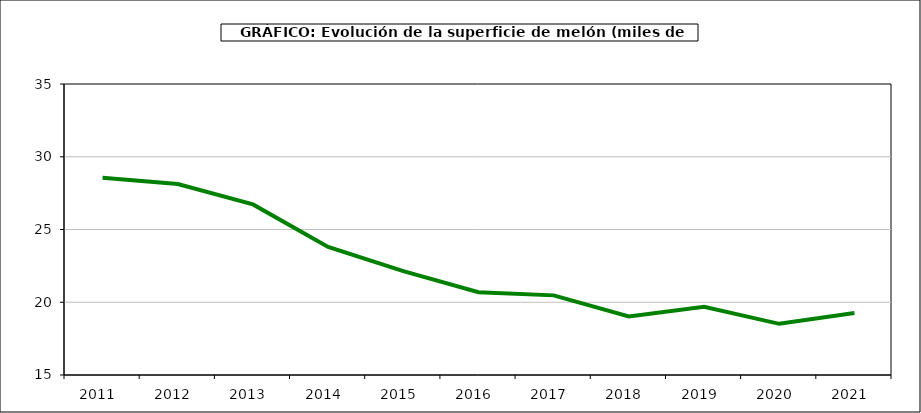
| Category | superficie |
|---|---|
| 2011.0 | 28.561 |
| 2012.0 | 28.13 |
| 2013.0 | 26.723 |
| 2014.0 | 23.8 |
| 2015.0 | 22.144 |
| 2016.0 | 20.686 |
| 2017.0 | 20.473 |
| 2018.0 | 19.025 |
| 2019.0 | 19.691 |
| 2020.0 | 18.517 |
| 2021.0 | 19.26 |